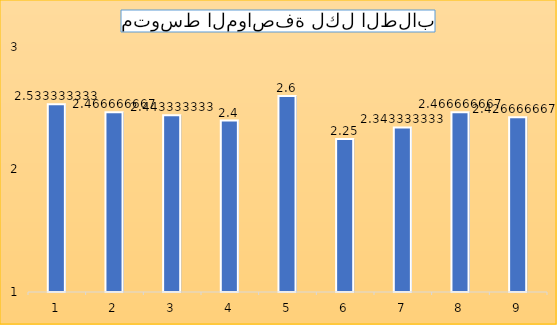
| Category | Series 0 |
|---|---|
| 0 | 2.533 |
| 1 | 2.467 |
| 2 | 2.443 |
| 3 | 2.4 |
| 4 | 2.6 |
| 5 | 2.25 |
| 6 | 2.343 |
| 7 | 2.467 |
| 8 | 2.427 |